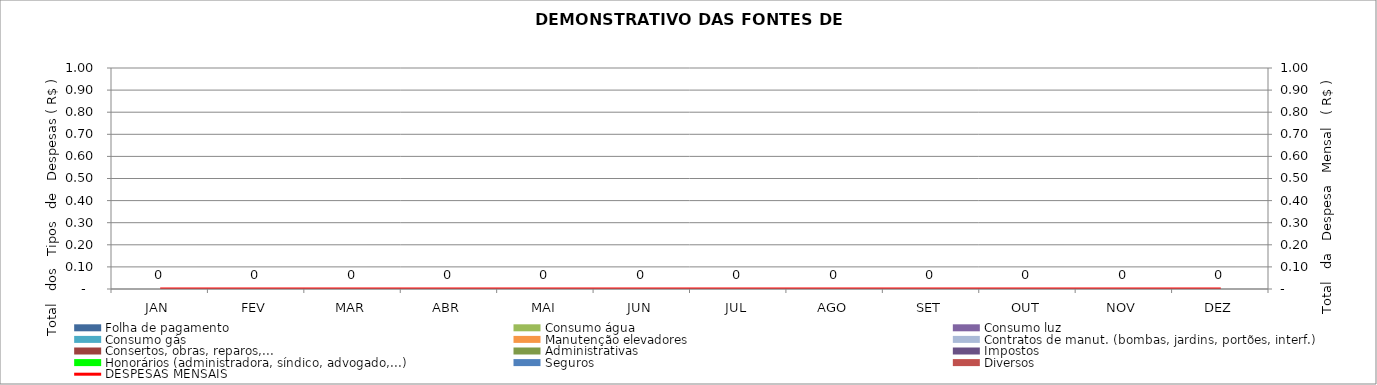
| Category | Folha de pagamento | Consumo água | Consumo luz | Consumo gás | Manutenção elevadores | Contratos de manut. (bombas, jardins, portões, interf.) | Consertos, obras, reparos,... | Administrativas | Impostos | Honorários (administradora, síndico, advogado,...) | Seguros | Diversos |
|---|---|---|---|---|---|---|---|---|---|---|---|---|
| JAN | 0 | 0 | 0 | 0 | 0 | 0 | 0 | 0 | 0 | 0 | 0 | 0 |
| FEV | 0 | 0 | 0 | 0 | 0 | 0 | 0 | 0 | 0 | 0 | 0 | 0 |
| MAR | 0 | 0 | 0 | 0 | 0 | 0 | 0 | 0 | 0 | 0 | 0 | 0 |
| ABR | 0 | 0 | 0 | 0 | 0 | 0 | 0 | 0 | 0 | 0 | 0 | 0 |
| MAI | 0 | 0 | 0 | 0 | 0 | 0 | 0 | 0 | 0 | 0 | 0 | 0 |
| JUN | 0 | 0 | 0 | 0 | 0 | 0 | 0 | 0 | 0 | 0 | 0 | 0 |
| JUL | 0 | 0 | 0 | 0 | 0 | 0 | 0 | 0 | 0 | 0 | 0 | 0 |
| AGO | 0 | 0 | 0 | 0 | 0 | 0 | 0 | 0 | 0 | 0 | 0 | 0 |
| SET | 0 | 0 | 0 | 0 | 0 | 0 | 0 | 0 | 0 | 0 | 0 | 0 |
| OUT | 0 | 0 | 0 | 0 | 0 | 0 | 0 | 0 | 0 | 0 | 0 | 0 |
| NOV | 0 | 0 | 0 | 0 | 0 | 0 | 0 | 0 | 0 | 0 | 0 | 0 |
| DEZ | 0 | 0 | 0 | 0 | 0 | 0 | 0 | 0 | 0 | 0 | 0 | 0 |